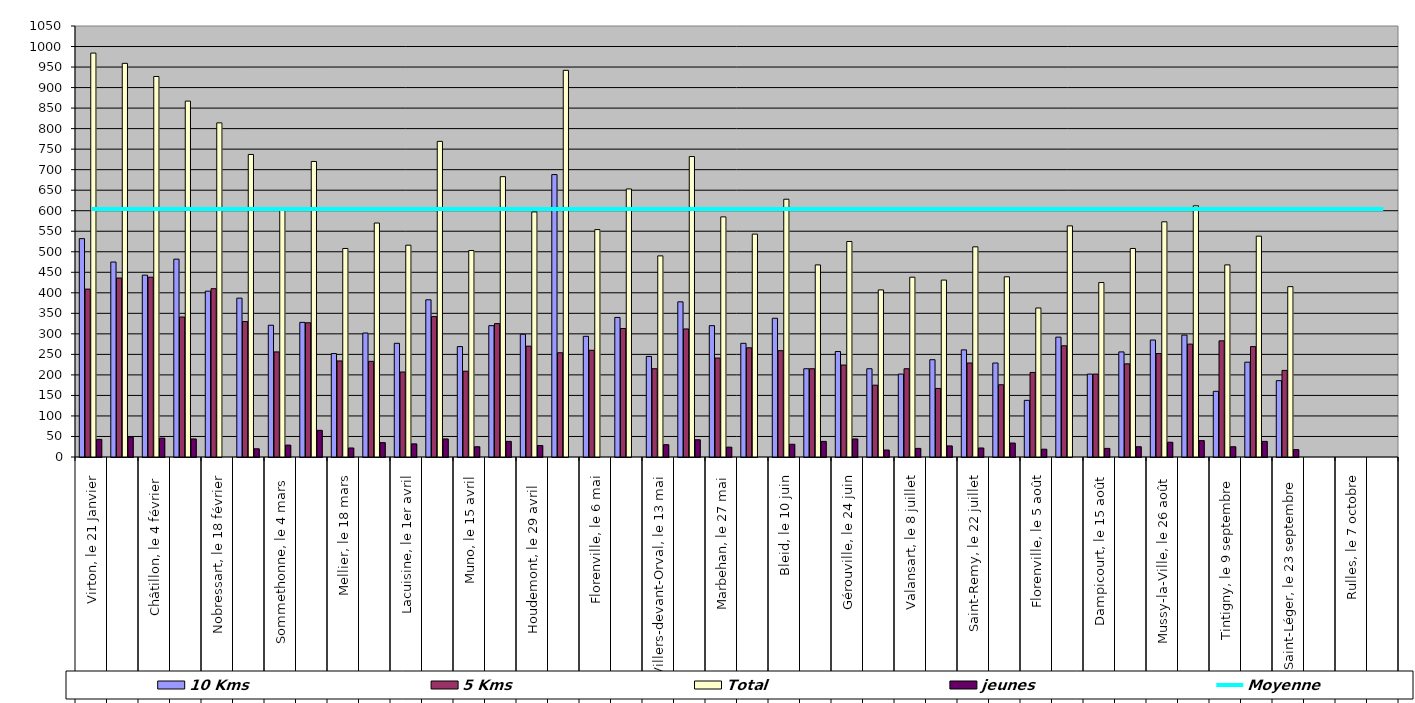
| Category | 10 Kms | 5 Kms | Total | jeunes |
|---|---|---|---|---|
| 0 | 532 | 409 | 984 | 43 |
| 1 | 475 | 436 | 959 | 48 |
| 2 | 443 | 438 | 927 | 46 |
| 3 | 482 | 341 | 867 | 44 |
| 4 | 404 | 410 | 814 | 0 |
| 5 | 387 | 330 | 737 | 20 |
| 6 | 321 | 256 | 606 | 29 |
| 7 | 328 | 327 | 720 | 65 |
| 8 | 252 | 234 | 508 | 22 |
| 9 | 302 | 233 | 570 | 35 |
| 10 | 277 | 207 | 516 | 32 |
| 11 | 383 | 342 | 769 | 44 |
| 12 | 269 | 209 | 503 | 25 |
| 13 | 320 | 325 | 683 | 38 |
| 14 | 299 | 270 | 597 | 28 |
| 15 | 688 | 254 | 942 | 0 |
| 16 | 294 | 260 | 554 | 0 |
| 17 | 340 | 313 | 653 | 0 |
| 18 | 245 | 215 | 490 | 30 |
| 19 | 378 | 312 | 732 | 42 |
| 20 | 320 | 241 | 585 | 24 |
| 21 | 277 | 266 | 543 | 0 |
| 22 | 338 | 259 | 628 | 31 |
| 23 | 215 | 215 | 468 | 38 |
| 24 | 257 | 224 | 525 | 44 |
| 25 | 215 | 175 | 407 | 17 |
| 26 | 202 | 215 | 438 | 21 |
| 27 | 237 | 167 | 431 | 27 |
| 28 | 261 | 229 | 512 | 22 |
| 29 | 229 | 176 | 439 | 34 |
| 30 | 138 | 206 | 363 | 19 |
| 31 | 292 | 271 | 563 | 0 |
| 32 | 202 | 202 | 425 | 21 |
| 33 | 256 | 227 | 508 | 25 |
| 34 | 285 | 252 | 573 | 36 |
| 35 | 297 | 275 | 612 | 40 |
| 36 | 160 | 283 | 468 | 25 |
| 37 | 231 | 269 | 538 | 38 |
| 38 | 186 | 211 | 415 | 18 |
| 39 | 0 | 0 | 0 | 0 |
| 40 | 0 | 0 | 0 | 0 |
| 41 | 0 | 0 | 0 | 0 |